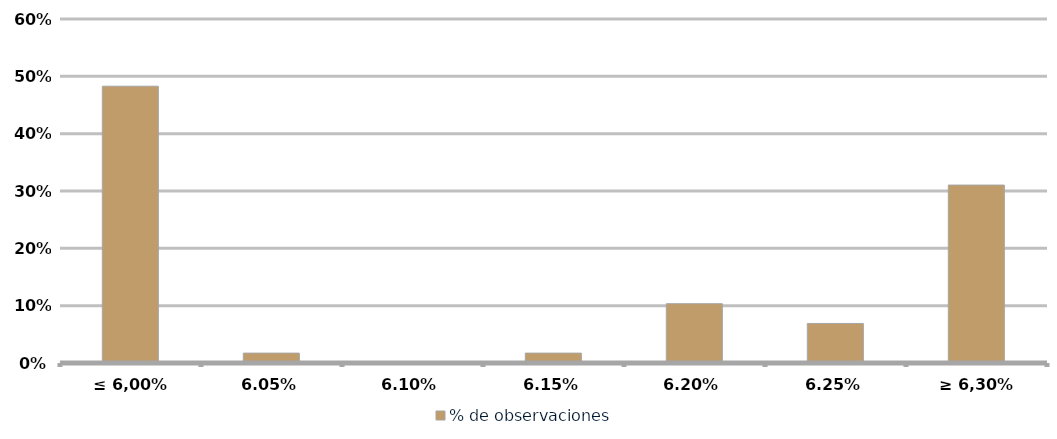
| Category | % de observaciones  |
|---|---|
| ≤ 6,00% | 0.483 |
| 6,05% | 0.017 |
| 6,10% | 0 |
| 6,15% | 0.017 |
| 6,20% | 0.103 |
| 6,25% | 0.069 |
| ≥ 6,30% | 0.31 |